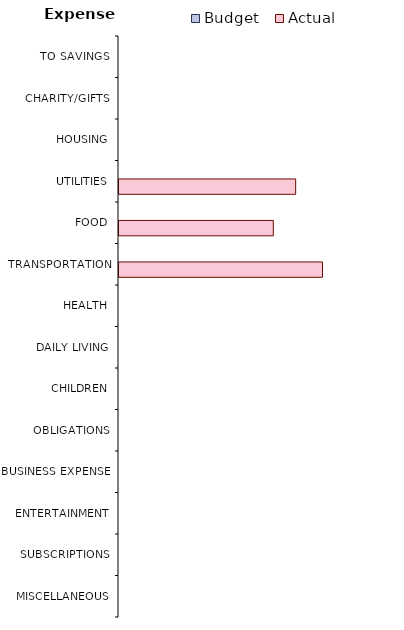
| Category | Budget | Actual |
|---|---|---|
| TO SAVINGS | 0 | 0 |
| CHARITY/GIFTS | 0 | 0 |
| HOUSING | 0 | 0 |
| UTILITIES | 0 | 100 |
| FOOD | 0 | 87.34 |
| TRANSPORTATION | 0 | 115.2 |
| HEALTH | 0 | 0 |
| DAILY LIVING | 0 | 0 |
| CHILDREN | 0 | 0 |
| OBLIGATIONS | 0 | 0 |
| BUSINESS EXPENSE | 0 | 0 |
| ENTERTAINMENT | 0 | 0 |
| SUBSCRIPTIONS | 0 | 0 |
| MISCELLANEOUS | 0 | 0 |